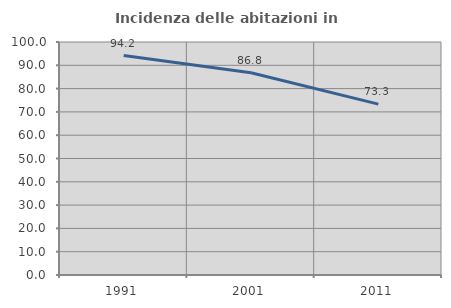
| Category | Incidenza delle abitazioni in proprietà  |
|---|---|
| 1991.0 | 94.203 |
| 2001.0 | 86.792 |
| 2011.0 | 73.333 |